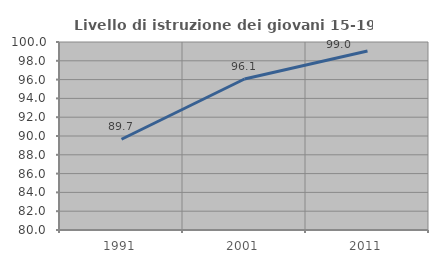
| Category | Livello di istruzione dei giovani 15-19 anni |
|---|---|
| 1991.0 | 89.655 |
| 2001.0 | 96.063 |
| 2011.0 | 99.038 |